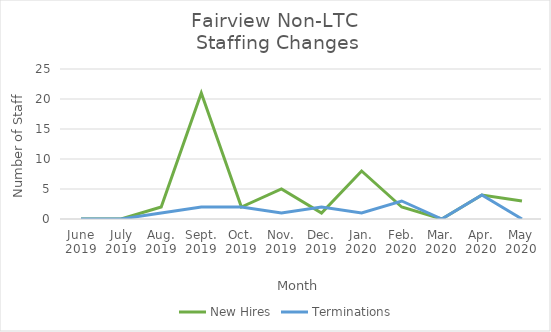
| Category | New Hires | Terminations |
|---|---|---|
| June
2019 | 0 | 0 |
| July
2019 | 0 | 0 |
| Aug.
2019 | 2 | 1 |
| Sept.
2019 | 21 | 2 |
| Oct.
2019 | 2 | 2 |
| Nov.
2019 | 5 | 1 |
| Dec.
2019 | 1 | 2 |
| Jan.
2020 | 8 | 1 |
| Feb.
2020 | 2 | 3 |
| Mar.
2020 | 0 | 0 |
| Apr.
2020 | 4 | 4 |
| May
2020 | 3 | 0 |